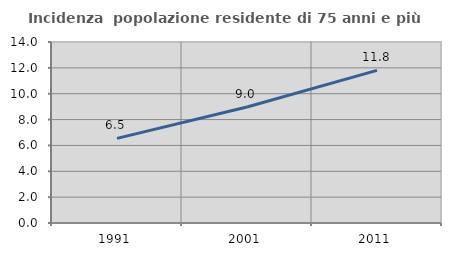
| Category | Incidenza  popolazione residente di 75 anni e più |
|---|---|
| 1991.0 | 6.546 |
| 2001.0 | 8.971 |
| 2011.0 | 11.805 |